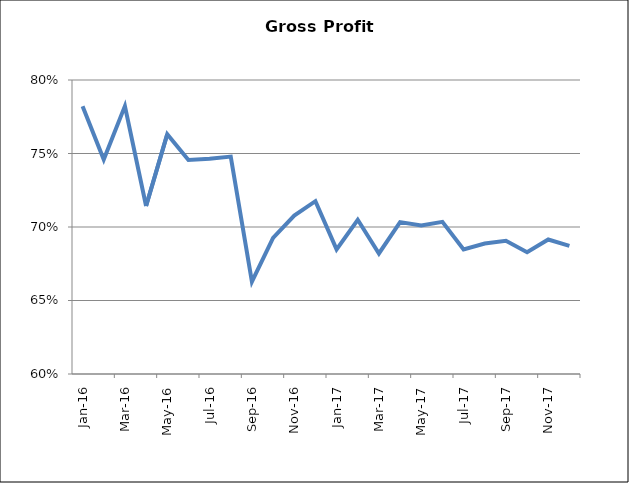
| Category | Revenues |
|---|---|
| 2016-01-01 | 0.782 |
| 2016-02-01 | 0.746 |
| 2016-03-01 | 0.782 |
| 2016-04-01 | 0.714 |
| 2016-05-01 | 0.763 |
| 2016-06-01 | 0.746 |
| 2016-07-01 | 0.746 |
| 2016-08-01 | 0.748 |
| 2016-09-01 | 0.663 |
| 2016-10-01 | 0.693 |
| 2016-11-01 | 0.708 |
| 2016-12-01 | 0.718 |
| 2017-01-01 | 0.685 |
| 2017-02-01 | 0.705 |
| 2017-03-01 | 0.682 |
| 2017-04-01 | 0.703 |
| 2017-05-01 | 0.701 |
| 2017-06-01 | 0.703 |
| 2017-07-01 | 0.685 |
| 2017-08-01 | 0.689 |
| 2017-09-01 | 0.691 |
| 2017-10-01 | 0.683 |
| 2017-11-01 | 0.691 |
| 2017-12-01 | 0.687 |